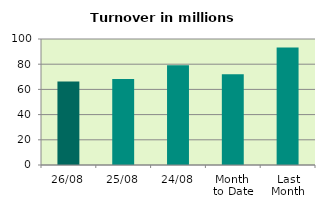
| Category | Series 0 |
|---|---|
| 26/08 | 66.192 |
| 25/08 | 68.334 |
| 24/08 | 79.235 |
| Month 
to Date | 71.928 |
| Last
Month | 93.279 |